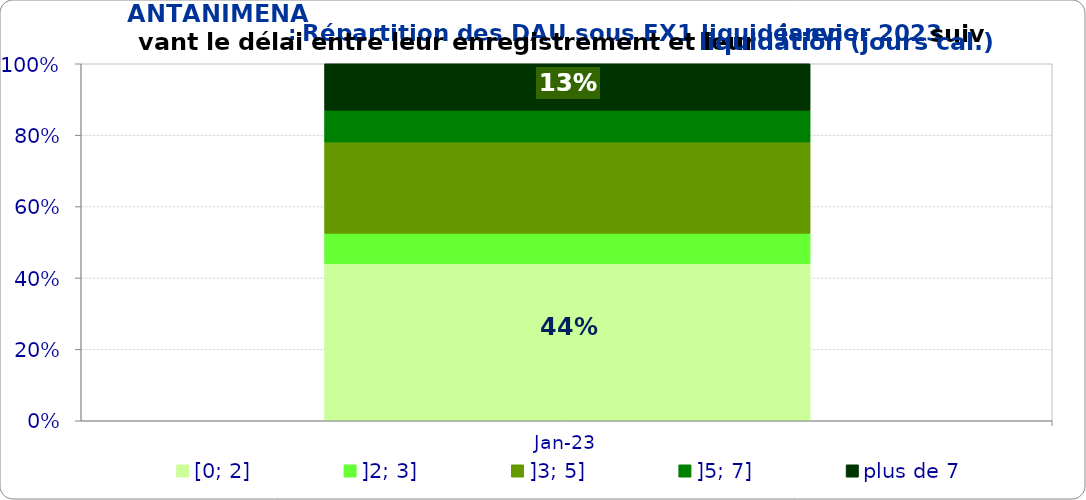
| Category | [0; 2] | ]2; 3] | ]3; 5] | ]5; 7] | plus de 7 |
|---|---|---|---|---|---|
| 2023-01-01 | 0.44 | 0.085 | 0.256 | 0.089 | 0.131 |